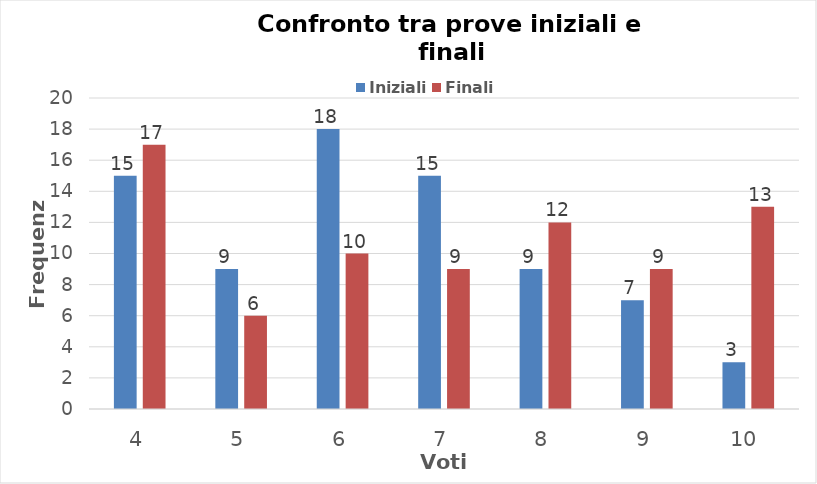
| Category | Iniziali | Finali |
|---|---|---|
| 4.0 | 15 | 17 |
| 5.0 | 9 | 6 |
| 6.0 | 18 | 10 |
| 7.0 | 15 | 9 |
| 8.0 | 9 | 12 |
| 9.0 | 7 | 9 |
| 10.0 | 3 | 13 |